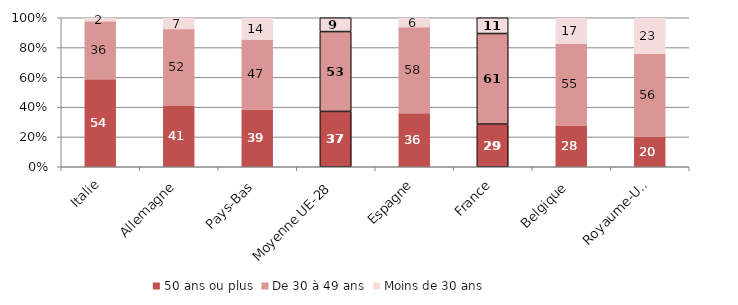
| Category | 50 ans ou plus | De 30 à 49 ans | Moins de 30 ans |
|---|---|---|---|
| Italie | 53.803 | 35.882 | 1.583 |
| Allemagne | 40.817 | 51.888 | 6.901 |
| Pays-Bas | 38.569 | 47.36 | 14.071 |
| Moyenne UE-28 | 36.712 | 52.985 | 9.164 |
| Espagne | 36.01 | 58.313 | 5.676 |
| France | 28.605 | 60.812 | 10.582 |
| Belgique | 27.883 | 55.274 | 16.779 |
| Royaume-Uni | 20.296 | 56.221 | 23.474 |